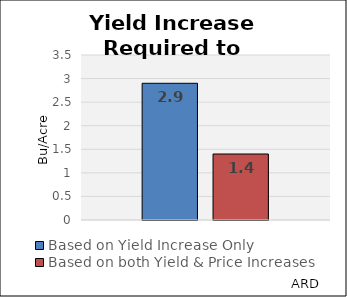
| Category | Based on Yield Increase Only | Based on both Yield & Price Increases |
|---|---|---|
|  | 2.9 | 1.4 |